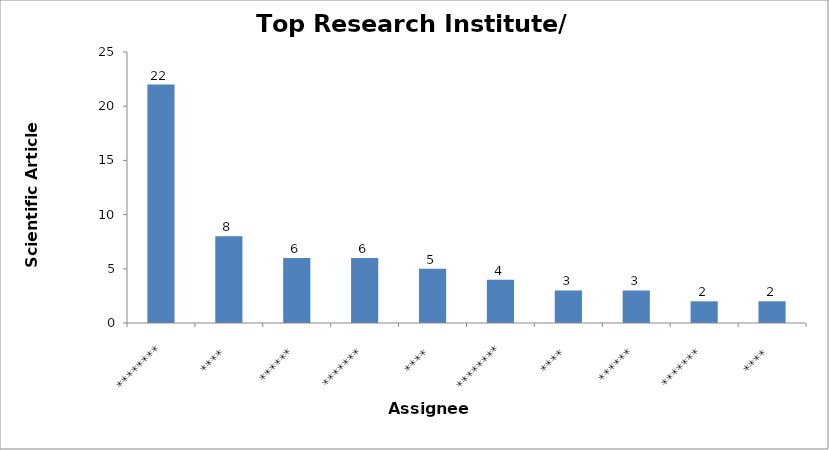
| Category | Top Assignees |
|---|---|
| ******** | 22 |
| **** | 8 |
| ****** | 6 |
| ******* | 6 |
| **** | 5 |
| ******** | 4 |
| **** | 3 |
| ****** | 3 |
| ******* | 2 |
| **** | 2 |